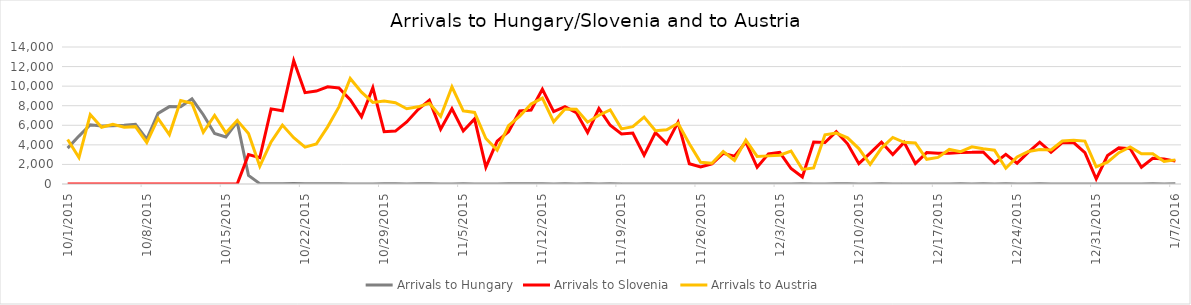
| Category | Arrivals to Hungary | Arrivals to Slovenia | Arrivals to Austria |
|---|---|---|---|
| 10/1/15 | 3667 | 0 | 4550 |
| 10/2/15 | 4897 | 0 | 2700 |
| 10/3/15 | 6056 | 0 | 7100 |
| 10/4/15 | 5925 | 0 | 5800 |
| 10/5/15 | 5952 | 0 | 6100 |
| 10/6/15 | 6000 | 0 | 5800 |
| 10/7/15 | 6103 | 0 | 5861 |
| 10/8/15 | 4583 | 6 | 4229 |
| 10/9/15 | 7215 | 0 | 6700 |
| 10/10/15 | 7907 | 0 | 5050 |
| 10/11/15 | 7897 | 0 | 8540 |
| 10/12/15 | 8702 | 0 | 8240 |
| 10/13/15 | 7081 | 0 | 5280 |
| 10/14/15 | 5157 | 0 | 7000 |
| 10/15/15 | 4808 | 0 | 5235 |
| 10/16/15 | 6353 | 0 | 6500 |
| 10/17/15 | 870 | 3000 | 5155 |
| 10/18/15 | 41 | 2700 | 1822 |
| 10/19/15 | 22 | 7677 | 4300 |
| 10/20/15 | 36 | 7478 | 6017 |
| 10/21/15 | 39 | 12616 | 4737 |
| 10/22/15 | 32 | 9339 | 3767 |
| 10/23/15 | 29 | 9500 | 4092 |
| 10/24/15 | 35 | 9925 | 5841 |
| 10/25/15 | 34 | 9818 | 7882 |
| 10/26/15 | 12 | 8625 | 10784 |
| 10/27/15 | 7 | 6877 | 9390 |
| 10/28/15 | 4 | 9848 | 8336 |
| 10/29/15 | 23 | 5341 | 8473 |
| 10/30/15 | 18 | 5409 | 8302 |
| 10/31/15 | 10 | 6344 | 7691 |
| 11/1/15 | 14 | 7611 | 7887 |
| 11/2/15 | 31 | 8568 | 8243 |
| 11/3/15 | 8 | 5591 | 6900 |
| 11/4/15 | 10 | 7693 | 9930 |
| 11/5/15 | 18 | 5426 | 7478 |
| 11/6/15 | 4 | 6655 | 7315 |
| 11/7/15 | 8 | 1716 | 4648 |
| 11/8/15 | 9 | 4381 | 3465 |
| 11/9/15 | 25 | 5341 | 5962 |
| 11/10/15 | 14 | 7457 | 6933 |
| 11/11/15 | 13 | 7554 | 8169 |
| 11/12/15 | 23 | 9681 | 8777 |
| 11/13/15 | 6 | 7397 | 6351 |
| 11/14/15 | 21 | 7905 | 7659 |
| 11/15/15 | 8 | 7300 | 7632 |
| 11/16/15 | 15 | 5261 | 6319 |
| 11/17/15 | 5 | 7704 | 7026 |
| 11/18/15 | 15 | 5998 | 7577 |
| 11/19/15 | 4 | 5119 | 5635 |
| 11/20/15 | 9 | 5211 | 5865 |
| 11/21/15 | 2 | 2952 | 6836 |
| 11/22/15 | 11 | 5260 | 5446 |
| 11/23/15 | 4 | 4102 | 5546 |
| 11/24/15 | 4 | 6297 | 6204 |
| 11/25/15 | 6 | 2070 | 4122 |
| 11/26/15 | 10 | 1742 | 2211 |
| 11/27/15 | 2 | 2065 | 2120 |
| 11/28/15 | 6 | 3139 | 3320 |
| 11/29/15 | 3 | 2843 | 2407 |
| 11/30/15 | 7 | 4274 | 4482 |
| 12/1/15 | 4 | 1709 | 2821 |
| 12/2/15 | 4 | 3077 | 2874 |
| 12/3/15 | 9 | 3237 | 2935 |
| 12/4/15 | 1 | 1577 | 3366 |
| 12/5/15 | 31 | 715 | 1493 |
| 12/6/15 | 7 | 4288 | 1643 |
| 12/7/15 | 0 | 4240 | 5035 |
| 12/8/15 | 13 | 5351 | 5210 |
| 12/9/15 | 14 | 4103 | 4714 |
| 12/10/15 | 3 | 2078 | 3623 |
| 12/11/15 | 0 | 3149 | 2000 |
| 12/12/15 | 13 | 4271 | 3675 |
| 12/13/15 | 10 | 3016 | 4754 |
| 12/14/15 | 3 | 4250 | 4263 |
| 12/15/15 | 2 | 2098 | 4193 |
| 12/16/15 | 6 | 3214 | 2519 |
| 12/17/15 | 0 | 3135 | 2717 |
| 12/18/15 | 11 | 3150 | 3532 |
| 12/19/15 | 31 | 3222 | 3305 |
| 12/20/15 | 8 | 3233 | 3800 |
| 12/21/15 | 25 | 3278 | 3611 |
| 12/22/15 | 1 | 2118 | 3451 |
| 12/23/15 | 21 | 3030 | 1613 |
| 12/24/15 | 8 | 2131 | 2764 |
| 12/25/15 | 2 | 3257 | 3321 |
| 12/26/15 | 17 | 4274 | 3532 |
| 12/27/15 | 10 | 3253 | 3476 |
| 12/28/15 | 0 | 4228 | 4394 |
| 12/29/15 | 0 | 4239 | 4468 |
| 12/30/15 | 11 | 3195 | 4386 |
| 12/31/15 | 5 | 511 | 1756 |
| 1/1/16 | 0 | 2914 | 2226 |
| 1/2/16 | 0 | 3690 | 3199 |
| 1/3/16 | 0 | 3619 | 3793 |
| 1/4/16 | 0 | 1708 | 3085 |
| 1/5/16 | 18 | 2626 | 3091 |
| 1/6/16 | 5 | 2550 | 2299 |
| 1/7/16 | 31 | 2337 | 2466 |